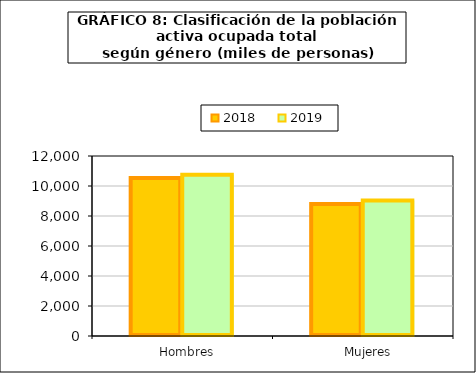
| Category | 2018 | 2019 |
|---|---|---|
|    Hombres | 10531.95 | 10745.6 |
|    Mujeres | 8795.75 | 9033.7 |